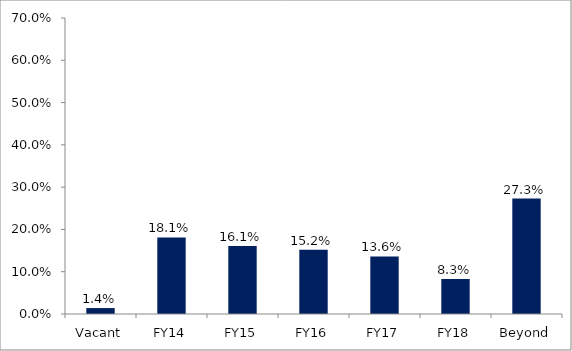
| Category | Series 0 |
|---|---|
| Vacant | 0.014 |
| FY14 | 0.181 |
| FY15 | 0.161 |
| FY16 | 0.152 |
| FY17 | 0.136 |
| FY18 | 0.083 |
| Beyond | 0.273 |